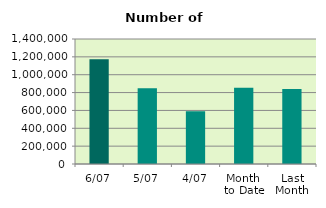
| Category | Series 0 |
|---|---|
| 6/07 | 1172632 |
| 5/07 | 848718 |
| 4/07 | 589920 |
| Month 
to Date | 852837.5 |
| Last
Month | 840506.364 |